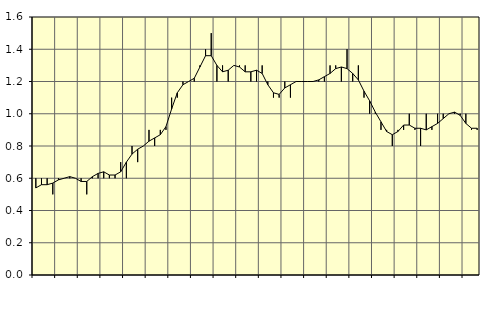
| Category | Piggar | Fast anställda utomlands |
|---|---|---|
| nan | 0.6 | 0.54 |
| 1.0 | 0.6 | 0.56 |
| 1.0 | 0.6 | 0.56 |
| 1.0 | 0.5 | 0.57 |
| nan | 0.6 | 0.59 |
| 2.0 | 0.6 | 0.6 |
| 2.0 | 0.6 | 0.61 |
| 2.0 | 0.6 | 0.6 |
| nan | 0.6 | 0.58 |
| 3.0 | 0.5 | 0.58 |
| 3.0 | 0.6 | 0.61 |
| 3.0 | 0.6 | 0.63 |
| nan | 0.6 | 0.64 |
| 4.0 | 0.6 | 0.62 |
| 4.0 | 0.6 | 0.62 |
| 4.0 | 0.7 | 0.64 |
| nan | 0.6 | 0.7 |
| 5.0 | 0.8 | 0.75 |
| 5.0 | 0.7 | 0.78 |
| 5.0 | 0.8 | 0.8 |
| nan | 0.9 | 0.83 |
| 6.0 | 0.8 | 0.85 |
| 6.0 | 0.9 | 0.87 |
| 6.0 | 0.9 | 0.92 |
| nan | 1.1 | 1.03 |
| 7.0 | 1.1 | 1.13 |
| 7.0 | 1.2 | 1.18 |
| 7.0 | 1.2 | 1.2 |
| nan | 1.2 | 1.22 |
| 8.0 | 1.3 | 1.29 |
| 8.0 | 1.4 | 1.36 |
| 8.0 | 1.5 | 1.36 |
| nan | 1.2 | 1.3 |
| 9.0 | 1.3 | 1.26 |
| 9.0 | 1.2 | 1.27 |
| 9.0 | 1.3 | 1.3 |
| nan | 1.3 | 1.29 |
| 10.0 | 1.3 | 1.26 |
| 10.0 | 1.2 | 1.26 |
| 10.0 | 1.2 | 1.27 |
| nan | 1.3 | 1.25 |
| 11.0 | 1.2 | 1.18 |
| 11.0 | 1.1 | 1.13 |
| 11.0 | 1.1 | 1.12 |
| nan | 1.2 | 1.16 |
| 12.0 | 1.1 | 1.18 |
| 12.0 | 1.2 | 1.2 |
| 12.0 | 1.2 | 1.2 |
| nan | 1.2 | 1.2 |
| 13.0 | 1.2 | 1.2 |
| 13.0 | 1.2 | 1.21 |
| 13.0 | 1.2 | 1.23 |
| nan | 1.3 | 1.25 |
| 14.0 | 1.3 | 1.28 |
| 14.0 | 1.2 | 1.29 |
| 14.0 | 1.4 | 1.28 |
| nan | 1.2 | 1.25 |
| 15.0 | 1.3 | 1.21 |
| 15.0 | 1.1 | 1.14 |
| 15.0 | 1 | 1.08 |
| nan | 1 | 1.01 |
| 16.0 | 0.9 | 0.95 |
| 16.0 | 0.9 | 0.89 |
| 16.0 | 0.8 | 0.87 |
| nan | 0.9 | 0.89 |
| 17.0 | 0.9 | 0.93 |
| 17.0 | 1 | 0.93 |
| 17.0 | 0.9 | 0.91 |
| nan | 0.8 | 0.91 |
| 18.0 | 1 | 0.9 |
| 18.0 | 0.9 | 0.92 |
| 18.0 | 1 | 0.94 |
| nan | 1 | 0.97 |
| 19.0 | 1 | 1 |
| 19.0 | 1 | 1.01 |
| 19.0 | 1 | 0.99 |
| nan | 1 | 0.94 |
| 20.0 | 0.9 | 0.91 |
| 20.0 | 0.9 | 0.91 |